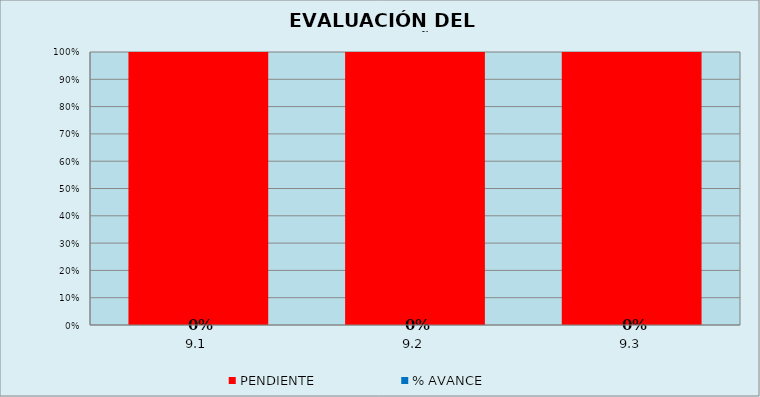
| Category | % AVANCE | PENDIENTE |
|---|---|---|
| 9.1 | 0 | 1 |
| 9.2 | 0 | 1 |
| 9.3 | 0 | 1 |